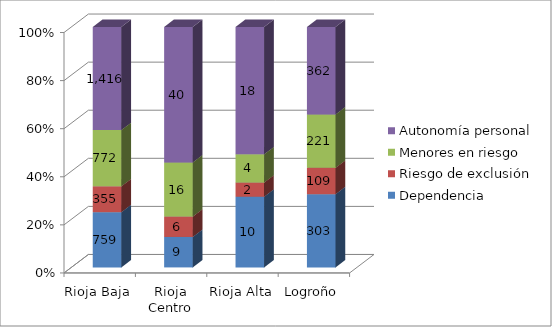
| Category | Dependencia | Riesgo de exclusión | Menores en riesgo | Autonomía personal |
|---|---|---|---|---|
| Rioja Baja | 759 | 355 | 772 | 1416 |
| Rioja Centro | 9 | 6 | 16 | 40 |
| Rioja Alta | 10 | 2 | 4 | 18 |
| Logroño | 303 | 109 | 221 | 362 |